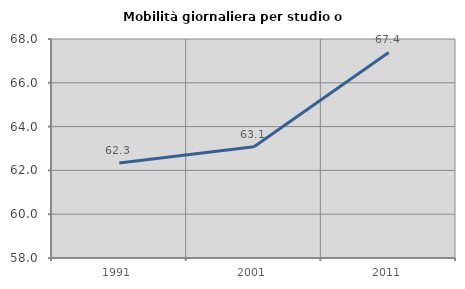
| Category | Mobilità giornaliera per studio o lavoro |
|---|---|
| 1991.0 | 62.339 |
| 2001.0 | 63.077 |
| 2011.0 | 67.387 |